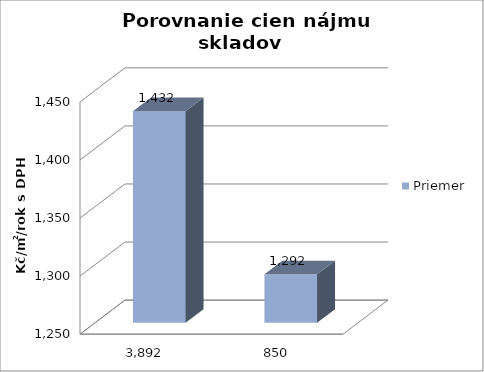
| Category | Minimum | Priemer | Maximum |
|---|---|---|---|
| 3891.891891891892 |  | 1432.254 |  |
| 850.0 |  | 1291.727 |  |